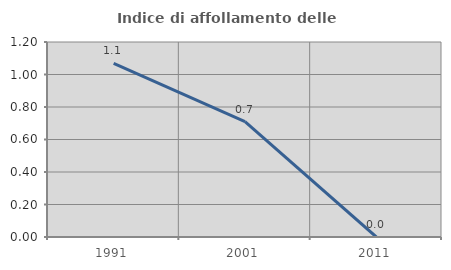
| Category | Indice di affollamento delle abitazioni  |
|---|---|
| 1991.0 | 1.069 |
| 2001.0 | 0.71 |
| 2011.0 | 0 |